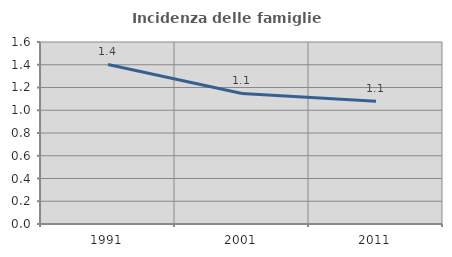
| Category | Incidenza delle famiglie numerose |
|---|---|
| 1991.0 | 1.403 |
| 2001.0 | 1.148 |
| 2011.0 | 1.078 |